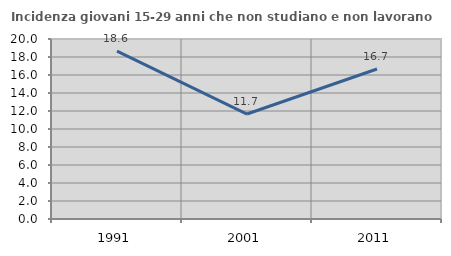
| Category | Incidenza giovani 15-29 anni che non studiano e non lavorano  |
|---|---|
| 1991.0 | 18.644 |
| 2001.0 | 11.662 |
| 2011.0 | 16.667 |